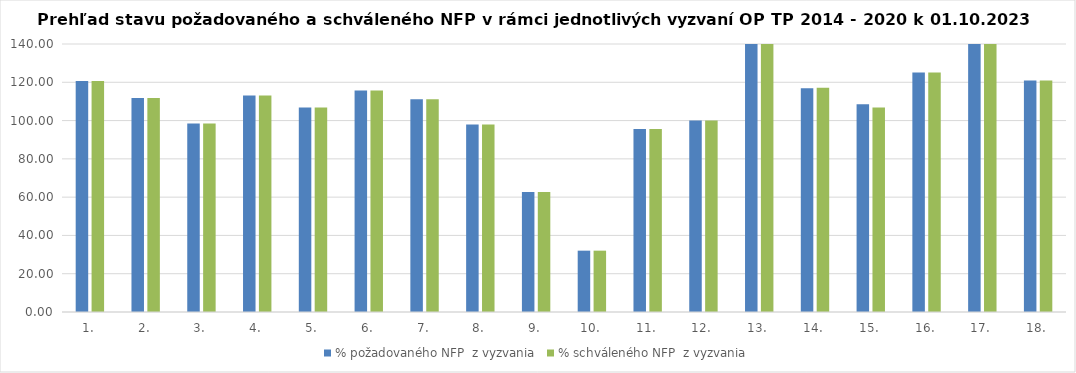
| Category | % požadovaného NFP  z vyzvania | % schváleného NFP  z vyzvania |
|---|---|---|
| 1. | 120.673 | 120.673 |
| 2. | 111.84 | 111.84 |
| 3. | 98.474 | 98.474 |
| 4. | 113.162 | 113.162 |
| 5. | 106.767 | 106.767 |
| 6. | 115.745 | 115.745 |
| 7. | 111.089 | 111.089 |
| 8. | 97.998 | 97.998 |
| 9. | 62.727 | 62.727 |
| 10. | 32.041 | 32.041 |
| 11. | 95.621 | 95.621 |
| 12. | 100.009 | 100.009 |
| 13. | 151.956 | 151.956 |
| 14. | 116.9 | 117.109 |
| 15. | 108.564 | 106.849 |
| 16. | 125.057 | 125.057 |
| 17. | 171.931 | 171.931 |
| 18. | 120.879 | 120.879 |